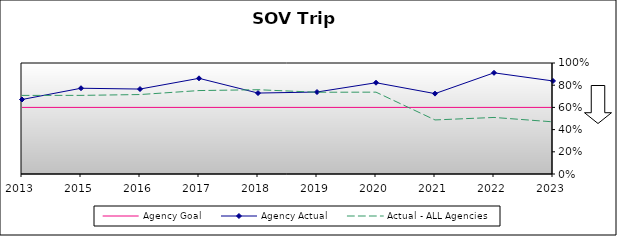
| Category | Agency Goal | Agency Actual | Actual - ALL Agencies |
|---|---|---|---|
| 2013.0 | 0.6 | 0.671 | 0.708 |
| 2015.0 | 0.6 | 0.773 | 0.708 |
| 2016.0 | 0.6 | 0.765 | 0.716 |
| 2017.0 | 0.6 | 0.862 | 0.752 |
| 2018.0 | 0.6 | 0.729 | 0.759 |
| 2019.0 | 0.6 | 0.738 | 0.736 |
| 2020.0 | 0.6 | 0.822 | 0.737 |
| 2021.0 | 0.6 | 0.724 | 0.487 |
| 2022.0 | 0.6 | 0.912 | 0.509 |
| 2023.0 | 0.6 | 0.838 | 0.47 |